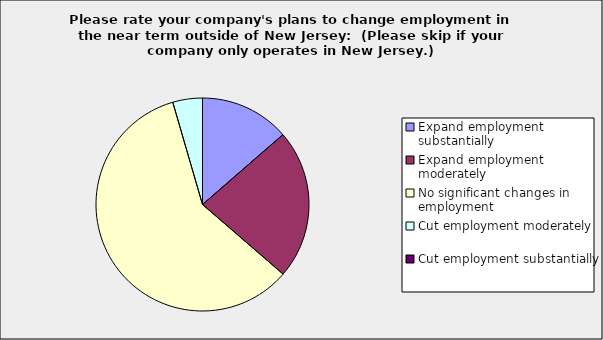
| Category | Series 0 |
|---|---|
| Expand employment substantially | 0.136 |
| Expand employment moderately | 0.227 |
| No significant changes in employment | 0.591 |
| Cut employment moderately | 0.045 |
| Cut employment substantially | 0 |